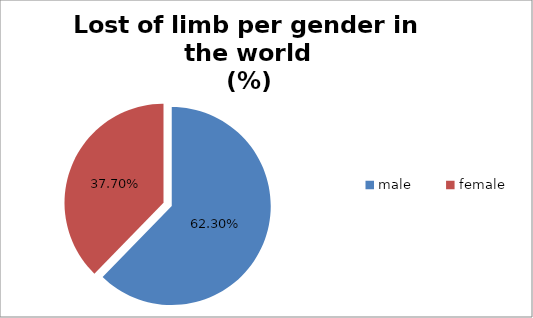
| Category | percentage |
|---|---|
| male | 0.623 |
| female | 0.377 |